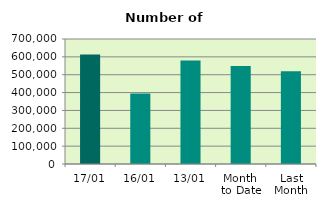
| Category | Series 0 |
|---|---|
| 17/01 | 612736 |
| 16/01 | 395274 |
| 13/01 | 579072 |
| Month 
to Date | 548674 |
| Last
Month | 519611.714 |